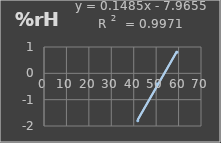
| Category | Humedad |
|---|---|
| 41.8 | -1.8 |
| 50.4 | -0.4 |
| 59.3 | 0.8 |